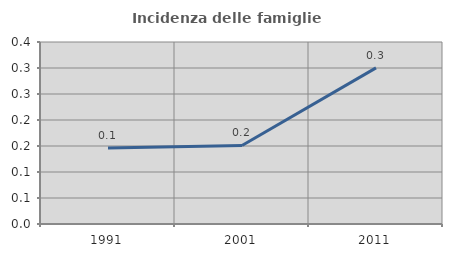
| Category | Incidenza delle famiglie numerose |
|---|---|
| 1991.0 | 0.146 |
| 2001.0 | 0.151 |
| 2011.0 | 0.3 |